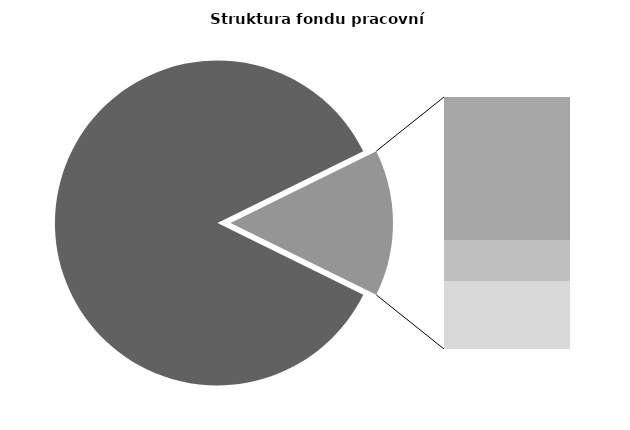
| Category | Series 0 |
|---|---|
| Průměrná měsíční odpracovaná doba bez přesčasu | 146.661 |
| Dovolená | 14.282 |
| Nemoc | 4.008 |
| Jiné | 6.744 |